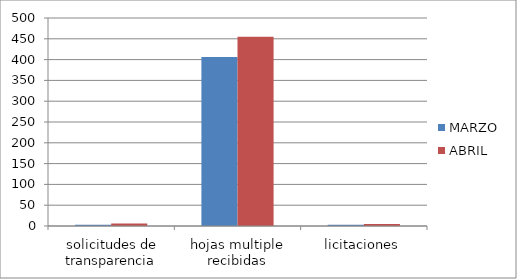
| Category | MARZO | ABRIL |
|---|---|---|
| solicitudes de transparencia | 3 | 6 |
| hojas multiple recibidas | 406 | 455 |
| licitaciones | 3 | 5 |